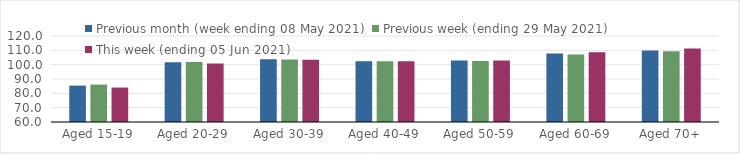
| Category | Previous month (week ending 08 May 2021) | Previous week (ending 29 May 2021) | This week (ending 05 Jun 2021) |
|---|---|---|---|
| Aged 15-19 | 85.38 | 86.12 | 84.03 |
| Aged 20-29 | 101.64 | 101.82 | 100.77 |
| Aged 30-39 | 103.76 | 103.65 | 103.37 |
| Aged 40-49 | 102.42 | 102.36 | 102.35 |
| Aged 50-59 | 102.89 | 102.55 | 102.93 |
| Aged 60-69 | 107.85 | 107.18 | 108.74 |
| Aged 70+ | 109.93 | 109.4 | 111.32 |